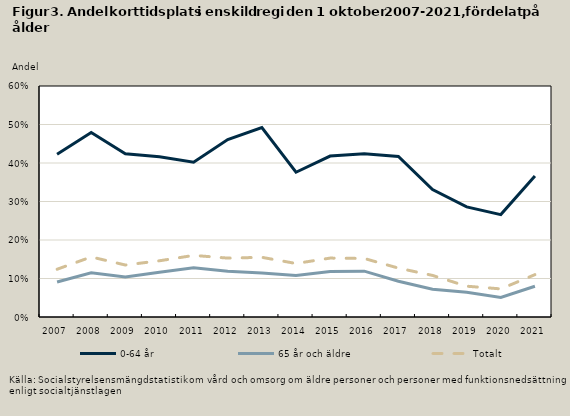
| Category | 0-64 år | 65 år och äldre | Totalt |
|---|---|---|---|
| 2007.0 | 0.423 | 0.091 | 0.124 |
| 2008.0 | 0.479 | 0.115 | 0.156 |
| 2009.0 | 0.424 | 0.104 | 0.135 |
| 2010.0 | 0.416 | 0.116 | 0.146 |
| 2011.0 | 0.402 | 0.128 | 0.16 |
| 2012.0 | 0.461 | 0.119 | 0.153 |
| 2013.0 | 0.492 | 0.114 | 0.155 |
| 2014.0 | 0.376 | 0.108 | 0.139 |
| 2015.0 | 0.418 | 0.118 | 0.153 |
| 2016.0 | 0.424 | 0.119 | 0.152 |
| 2017.0 | 0.417 | 0.093 | 0.127 |
| 2018.0 | 0.331 | 0.072 | 0.108 |
| 2019.0 | 0.286 | 0.064 | 0.08 |
| 2020.0 | 0.266 | 0.051 | 0.073 |
| 2021.0 | 0.366 | 0.08 | 0.11 |